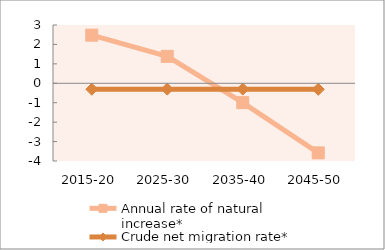
| Category | Annual rate of natural increase* | Crude net migration rate* |
|---|---|---|
| 2015-20 | 2.478 | -0.307 |
| 2025-30 | 1.386 | -0.302 |
| 2035-40 | -0.997 | -0.302 |
| 2045-50 | -3.581 | -0.311 |